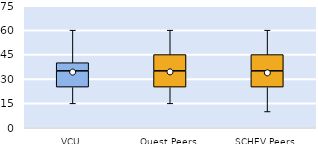
| Category | 25th | 50th | 75th |
|---|---|---|---|
| VCU | 25 | 10 | 5 |
| Quest Peers | 25 | 10 | 10 |
| SCHEV Peers | 25 | 10 | 10 |